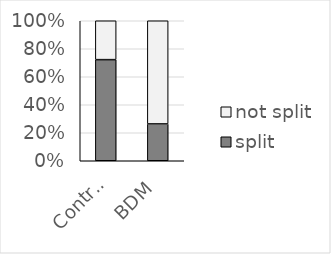
| Category | split | not split |
|---|---|---|
| Control | 13 | 5 |
| BDM | 5 | 14 |